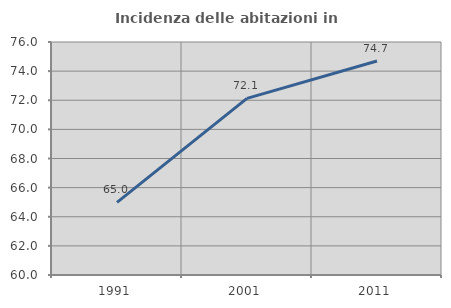
| Category | Incidenza delle abitazioni in proprietà  |
|---|---|
| 1991.0 | 64.984 |
| 2001.0 | 72.132 |
| 2011.0 | 74.692 |